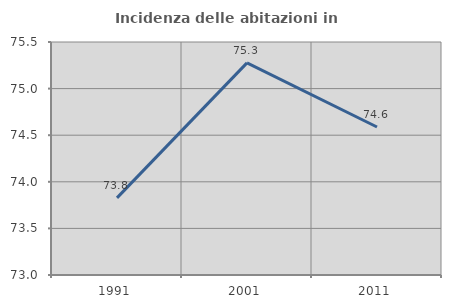
| Category | Incidenza delle abitazioni in proprietà  |
|---|---|
| 1991.0 | 73.827 |
| 2001.0 | 75.276 |
| 2011.0 | 74.588 |